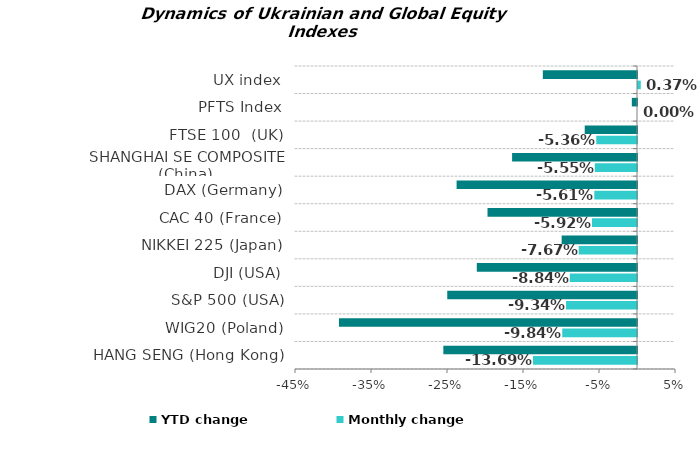
| Category | Monthly change | YTD change |
|---|---|---|
| HANG SENG (Hong Kong) | -0.137 | -0.255 |
| WIG20 (Poland) | -0.098 | -0.392 |
| S&P 500 (USA) | -0.093 | -0.25 |
| DJI (USA) | -0.088 | -0.211 |
| NIKKEI 225 (Japan) | -0.077 | -0.099 |
| CAC 40 (France) | -0.059 | -0.197 |
| DAX (Germany) | -0.056 | -0.237 |
| SHANGHAI SE COMPOSITE (China) | -0.056 | -0.164 |
| FTSE 100  (UK) | -0.054 | -0.069 |
| PFTS Index | 0 | -0.007 |
| UX index | 0.004 | -0.124 |